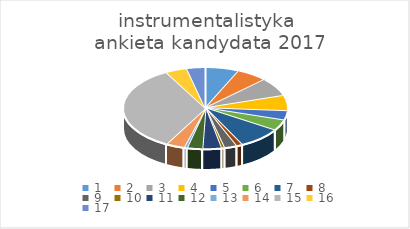
| Category | Series 0 |
|---|---|
| 0 | 11 |
| 1 | 10 |
| 2 | 12 |
| 3 | 10 |
| 4 | 6 |
| 5 | 7 |
| 6 | 14 |
| 7 | 2 |
| 8 | 4 |
| 9 | 1 |
| 10 | 6 |
| 11 | 5 |
| 12 | 1 |
| 13 | 6 |
| 14 | 56 |
| 15 | 7 |
| 16 | 6 |